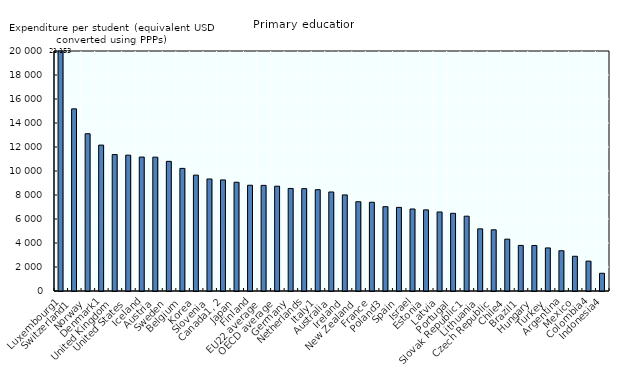
| Category | Primary education |
|---|---|
| Luxembourg1 | 21152.76 |
| Switzerland1 | 15177.26 |
| Norway | 13104.384 |
| Denmark1 | 12158.081 |
| United Kingdom | 11367.416 |
| United States | 11318.522 |
| Iceland | 11162.706 |
| Austria | 11154.486 |
| Sweden | 10804.312 |
| Belgium | 10216.37 |
| Korea | 9655.788 |
| Slovenia | 9335.47 |
| Canada1, 2 | 9256.492 |
| Japan | 9062.007 |
| Finland | 8811.806 |
| EU22 average | 8802.868 |
| OECD average | 8733.121 |
| Germany | 8545.92 |
| Netherlands | 8529.228 |
| Italy1 | 8441.864 |
| Australia | 8251.454 |
| Ireland | 8006.795 |
| New Zealand | 7438.444 |
| France | 7396.081 |
| Poland3 | 7026.407 |
| Spain | 6969.735 |
| Israel | 6833.446 |
| Estonia | 6759.774 |
| Latvia | 6585.167 |
| Portugal | 6473.84 |
| Slovak Republic1 | 6234.522 |
| Lithuania | 5179.411 |
| Czech Republic | 5100.848 |
| Chile4 | 4320.59 |
| Brazil1 | 3798.687 |
| Hungary | 3789.355 |
| Turkey | 3589.188 |
| Argentina | 3356.275 |
| Mexico | 2895.599 |
| Colombia4 | 2490.269 |
| Indonesia4 | 1475.577 |